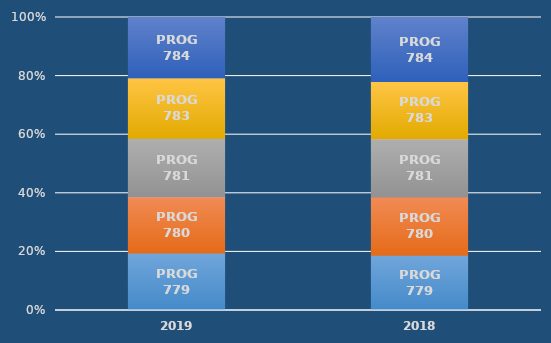
| Category | PROG 779 | PROG 780 | PROG 781 | PROG 783 | PROG 784 |
|---|---|---|---|---|---|
| 2019.0 | 0.893 | 0.873 | 0.912 | 0.938 | 0.94 |
| 2018.0 | 0.56 | 0.59 | 0.59 | 0.58 | 0.65 |